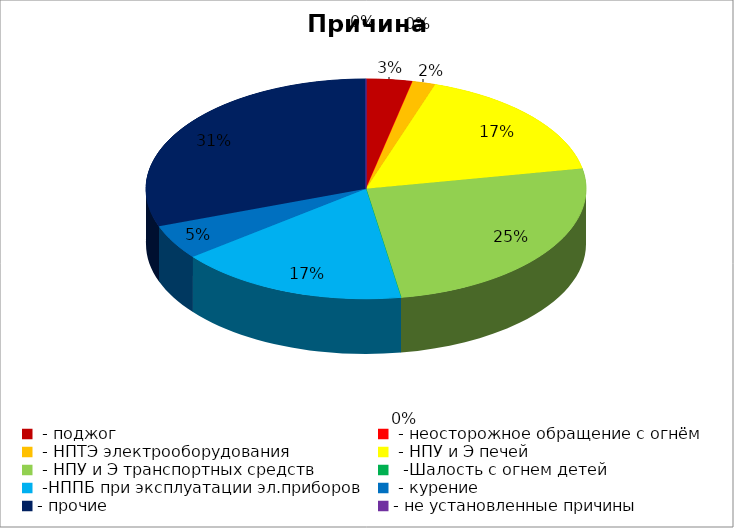
| Category | Причина пожара |
|---|---|
|  - поджог | 2 |
|  - неосторожное обращение с огнём | 0 |
|  - НПТЭ электрооборудования | 1 |
|  - НПУ и Э печей | 10 |
|  - НПУ и Э транспортных средств | 15 |
|   -Шалость с огнем детей | 0 |
|  -НППБ при эксплуатации эл.приборов | 10 |
|  - курение | 3 |
| - прочие | 18 |
| - не установленные причины | 0 |